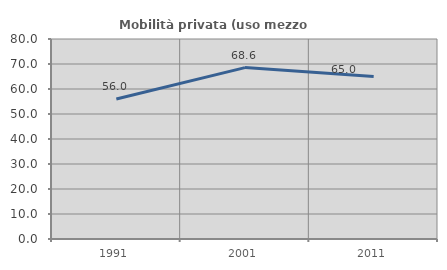
| Category | Mobilità privata (uso mezzo privato) |
|---|---|
| 1991.0 | 55.991 |
| 2001.0 | 68.557 |
| 2011.0 | 64.989 |